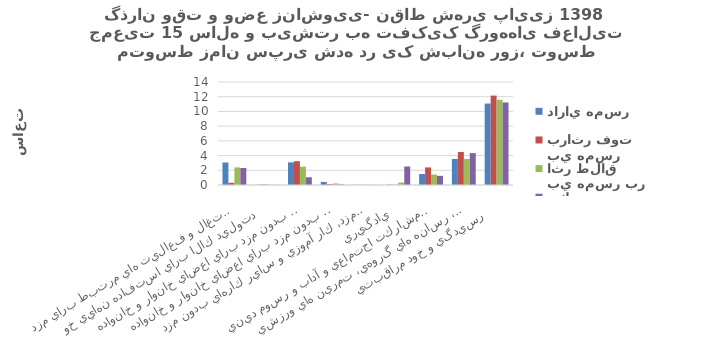
| Category | داراي همسر | بي همسر براثر فوت | بي همسر بر اثر طلاق | هرگز ازدواج نكرده |
|---|---|---|---|---|
| اشتغال و فعاليت هاي مرتبط براي مزد  | 3.06 | 0.3 | 2.39 | 2.31 |
| توليد كالا براي استفاده نهايي خود   | 0.04 | 0.06 | 0.03 | 0.02 |
| خدمات خانگي بدون مزد براي اعضاي خانوار و خانواده   | 3.08 | 3.24 | 2.49 | 1.05 |
| خدمات مراقبتي بدون مزد براي اعضاي خانوار و خانواده   | 0.42 | 0.12 | 0.21 | 0.07 |
| كارداوطلبانه بدون مزد، كار آموزي و ساير كارهاي بدون مزد  | 0.03 | 0.02 | 0.02 | 0.02 |
| يادگيري  | 0.05 | 0.03 | 0.33 | 2.52 |
| معاشرت، ارتباط، مشاركت اجتماعي و آداب و رسوم ديني  | 1.49 | 2.39 | 1.42 | 1.25 |
| فرهنگ، فراغت، رسانه هاي گروهي، تمرين هاي ورزشي  | 3.54 | 4.49 | 3.54 | 4.34 |
| رسيدگي و خود مراقبتي   | 11.07 | 12.15 | 11.58 | 11.22 |